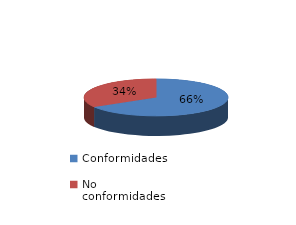
| Category | Series 0 |
|---|---|
| Conformidades | 1128 |
| No conformidades | 572 |